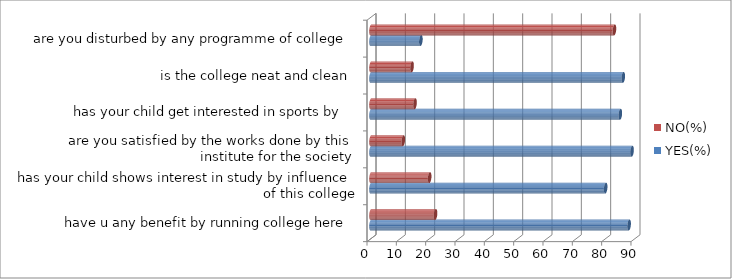
| Category | YES(%) | NO(%) |
|---|---|---|
| have u any benefit by running college here | 88 | 22 |
| has your child shows interest in study by influence of this college | 80 | 20 |
| are you satisfied by the works done by this institute for the society | 89 | 11 |
| has your child get interested in sports by  | 85 | 15 |
| is the college neat and clean | 86 | 14 |
| are you disturbed by any programme of college | 17 | 83 |